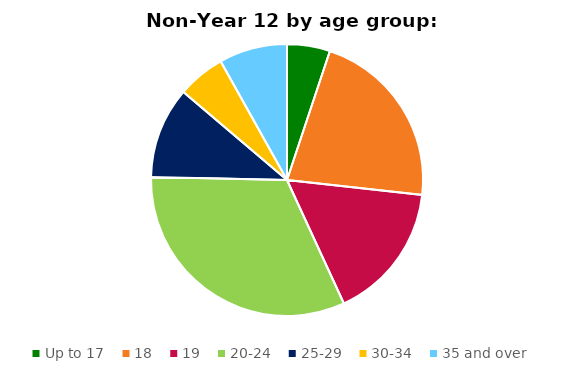
| Category | Series 0 |
|---|---|
| Up to 17 | 1512 |
| 18 | 6404 |
| 19 | 4848 |
| 20-24 | 9538 |
| 25-29 | 3209 |
| 30-34 | 1683 |
| 35 and over | 2401 |